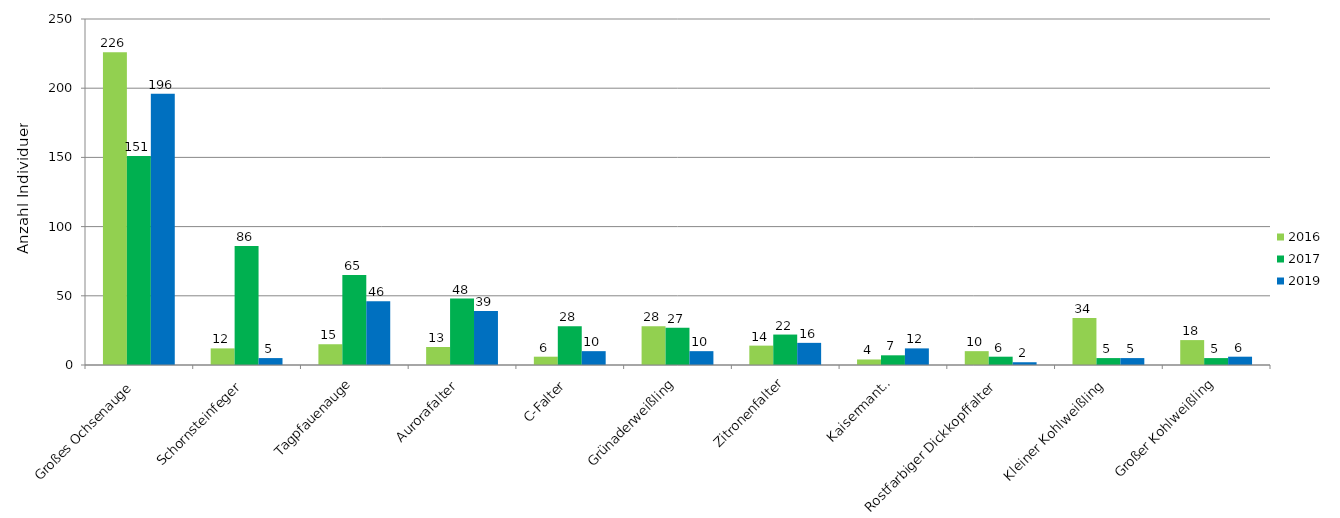
| Category | 2016 | 2017 | 2019 |
|---|---|---|---|
| Großes Ochsenauge | 226 | 151 | 196 |
| Schornsteinfeger | 12 | 86 | 5 |
| Tagpfauenauge | 15 | 65 | 46 |
| Aurorafalter | 13 | 48 | 39 |
| C-Falter | 6 | 28 | 10 |
| Grünaderweißling | 28 | 27 | 10 |
| Zitronenfalter | 14 | 22 | 16 |
| Kaisermantel | 4 | 7 | 12 |
| Rostfarbiger Dickkopffalter | 10 | 6 | 2 |
| Kleiner Kohlweißling | 34 | 5 | 5 |
| Großer Kohlweißling | 18 | 5 | 6 |